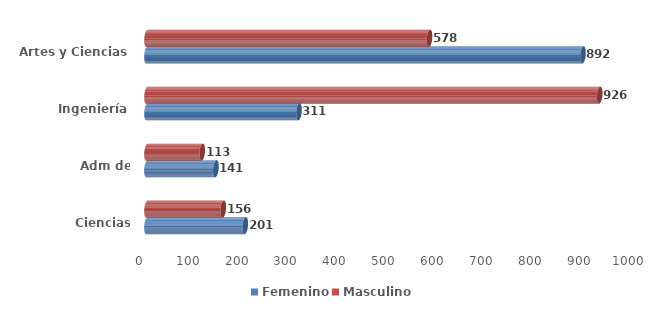
| Category | Femenino | Masculino |
|---|---|---|
| Ciencias Agrícolas | 201 | 156 |
| Adm de Empresas | 141 | 113 |
| Ingeniería | 311 | 926 |
| Artes y Ciencias | 892 | 578 |